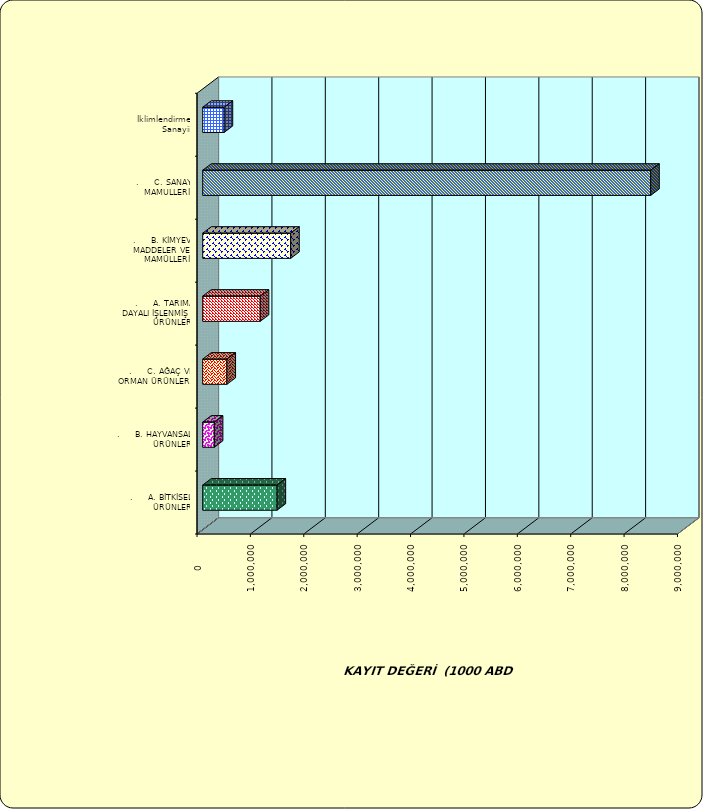
| Category | Series 0 |
|---|---|
| .     A. BİTKİSEL ÜRÜNLER | 1392674.604 |
| .     B. HAYVANSAL ÜRÜNLER | 217213.809 |
| .     C. AĞAÇ VE ORMAN ÜRÜNLERİ | 454062.888 |
| .     A. TARIMA DAYALI İŞLENMİŞ ÜRÜNLER | 1077484.202 |
| .     B. KİMYEVİ MADDELER VE MAMÜLLERİ | 1647917.363 |
| .     C. SANAYİ MAMULLERİ | 8391534.178 |
|  İklimlendirme Sanayii | 401180.805 |